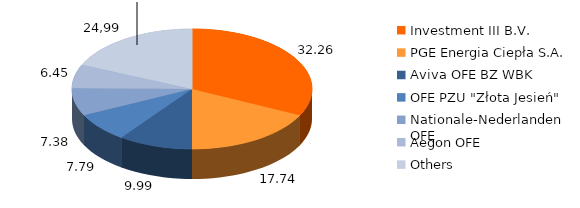
| Category | Series 2 | Series 3 | Series 1 | Series 0 |
|---|---|---|---|---|
| Investment III B.V.  | 32.263 | 32.263 | 4807132 | 4807132 |
| PGE Energia Ciepła S.A. | 17.737 | 17.737 | 2642869 | 2642869 |
| Aviva OFE BZ WBK | 9.993 | 9.993 | 1489000 | 1489000 |
| OFE PZU "Złota Jesień" | 7.785 | 7.785 | 1160000 | 1160000 |
| Nationale-Nederlanden OFE  | 7.383 | 7.383 | 1100000 | 1100000 |
| Aegon OFE | 6.448 | 6.448 | 960690 | 960690 |
| Others | 18.391 | 18.391 | 2740309 | 2740309 |